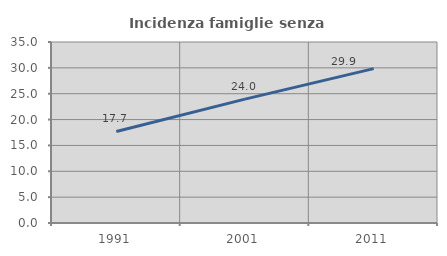
| Category | Incidenza famiglie senza nuclei |
|---|---|
| 1991.0 | 17.695 |
| 2001.0 | 23.957 |
| 2011.0 | 29.858 |